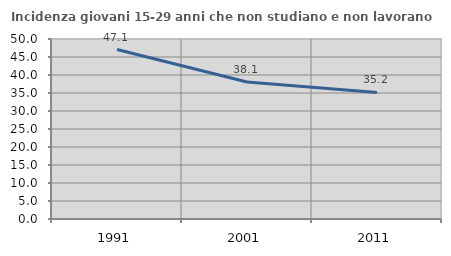
| Category | Incidenza giovani 15-29 anni che non studiano e non lavorano  |
|---|---|
| 1991.0 | 47.083 |
| 2001.0 | 38.068 |
| 2011.0 | 35.165 |